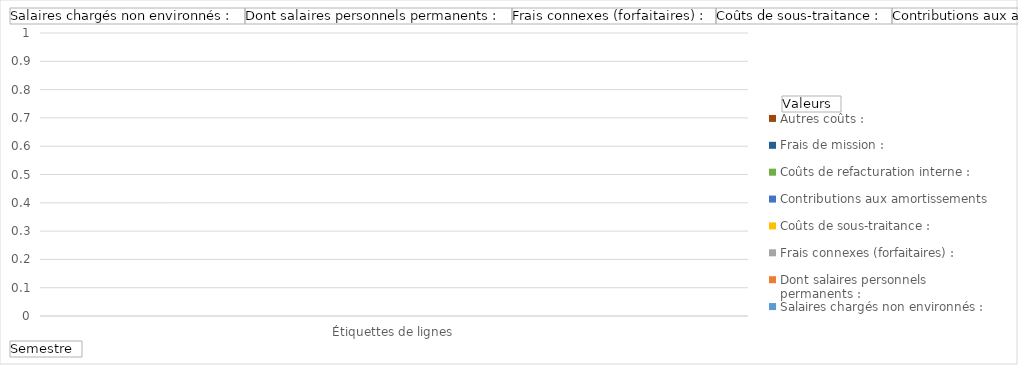
| Category | Salaires chargés non environnés : | Dont salaires personnels permanents : | Frais connexes (forfaitaires) : | Coûts de sous-traitance : | Contributions aux amortissements : | Coûts de refacturation interne : | Frais de mission : | Autres coûts : |
|---|---|---|---|---|---|---|---|---|
| (vide) | 0 |  | 0 | 0 | 0 | 0 | 0 | 0 |